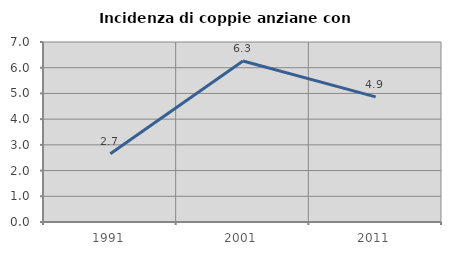
| Category | Incidenza di coppie anziane con figli |
|---|---|
| 1991.0 | 2.655 |
| 2001.0 | 6.263 |
| 2011.0 | 4.867 |